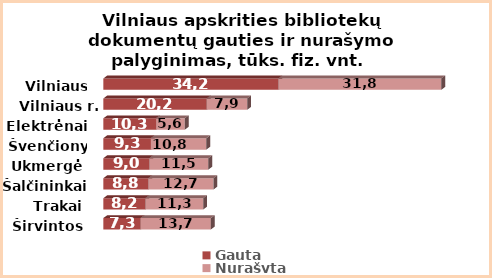
| Category | Gauta | Nurašyta |
|---|---|---|
| Širvintos | 7.3 | 13.7 |
| Trakai | 8.2 | 11.3 |
| Šalčininkai | 8.8 | 12.7 |
| Ukmergė | 9 | 11.5 |
| Švenčionys | 9.3 | 10.8 |
| Elektrėnai | 10.3 | 5.6 |
| Vilniaus r. | 20.2 | 7.9 |
| Vilniaus m. | 34.2 | 31.8 |